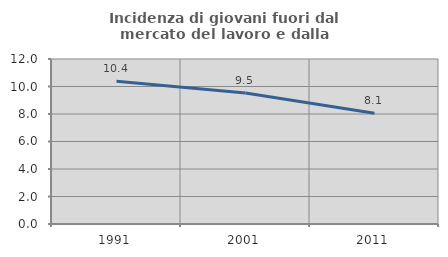
| Category | Incidenza di giovani fuori dal mercato del lavoro e dalla formazione  |
|---|---|
| 1991.0 | 10.385 |
| 2001.0 | 9.524 |
| 2011.0 | 8.054 |